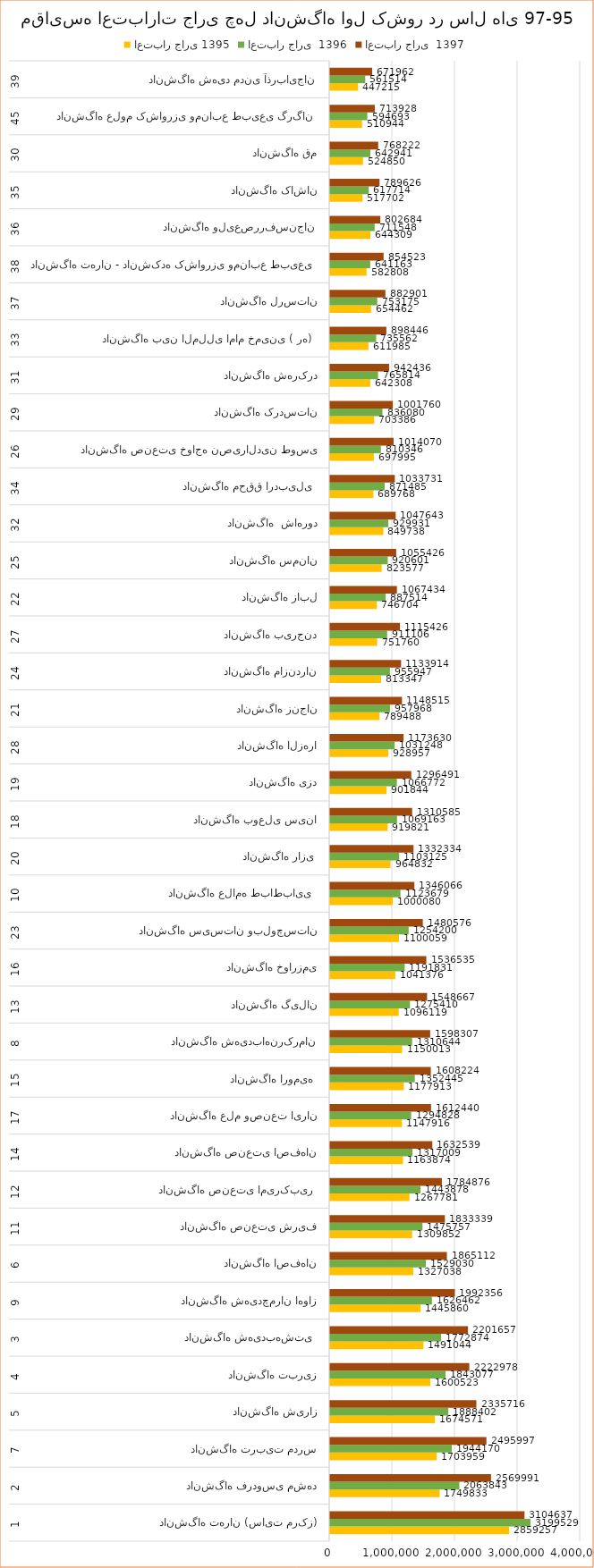
| Category | اعتبار جاری 1395 | اعتبار جاری  1396 | اعتبار جاری  1397 |
|---|---|---|---|
| 0 | 2859257 | 3199529.064 | 3104637 |
| 1 | 1749833 | 2063843.35 | 2569991 |
| 2 | 1703959 | 1944170.443 | 2495997 |
| 3 | 1674571 | 1888401.97 | 2335716 |
| 4 | 1600523 | 1843076.847 | 2222978 |
| 5 | 1491044 | 1772873.892 | 2201657 |
| 6 | 1445860 | 1626462.069 | 1992356 |
| 7 | 1327038 | 1529029.557 | 1865112 |
| 8 | 1309852 | 1475756.65 | 1833339 |
| 9 | 1267781 | 1443877.833 | 1784876 |
| 10 | 1163874 | 1317008.867 | 1632539 |
| 11 | 1147916 | 1294827.586 | 1612440 |
| 12 | 1177913 | 1352445.32 | 1608224 |
| 13 | 1150013 | 1310644.335 | 1598307 |
| 14 | 1096119 | 1275409.852 | 1548667 |
| 15 | 1041376 | 1191830.542 | 1536535 |
| 16 | 1100059 | 1254200 | 1480576 |
| 17 | 1000080 | 1123678.818 | 1346066 |
| 18 | 964832 | 1103125.123 | 1332334 |
| 19 | 919821 | 1069162.562 | 1310585 |
| 20 | 901844 | 1066772.414 | 1296491 |
| 21 | 928957 | 1031248.276 | 1173630 |
| 22 | 789488 | 957968.473 | 1148515 |
| 23 | 813347 | 955946.798 | 1133914 |
| 24 | 751760 | 911106.404 | 1115426 |
| 25 | 746704 | 887514.286 | 1067434 |
| 26 | 823577 | 920600.985 | 1055426 |
| 27 | 849738 | 929931.034 | 1047643 |
| 28 | 689768 | 871484.729 | 1033731 |
| 29 | 697995 | 810345.813 | 1014070 |
| 30 | 703386 | 836079.803 | 1001760 |
| 31 | 642308 | 765813.793 | 942436 |
| 32 | 611985 | 735561.576 | 898446 |
| 33 | 654462 | 753175.369 | 882901 |
| 34 | 582808 | 641162.562 | 854523 |
| 35 | 644309 | 711547.783 | 802684 |
| 36 | 517702 | 617714.286 | 789626 |
| 37 | 524850 | 642940.887 | 768222 |
| 38 | 510944 | 594692.611 | 713928 |
| 39 | 447215 | 561514.286 | 671962 |